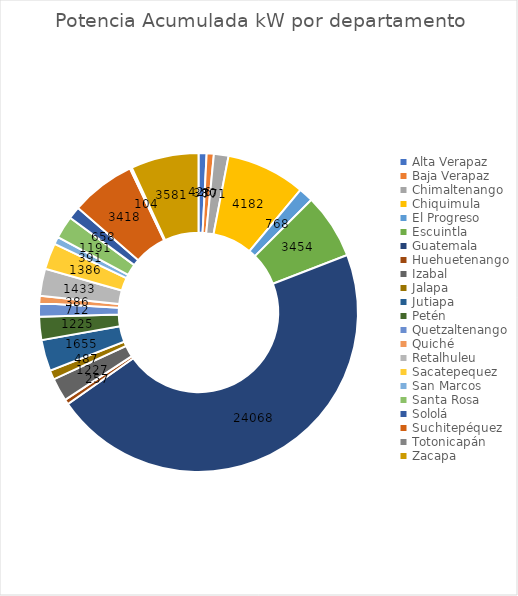
| Category | Potencia Acumulada kW |
|---|---|
| Alta Verapaz | 426 |
| Baja Verapaz | 380 |
| Chimaltenango | 771 |
| Chiquimula | 4182 |
| El Progreso | 768 |
| Escuintla | 3454 |
| Guatemala | 24068 |
| Huehuetenango | 257 |
| Izabal | 1227 |
| Jalapa | 487 |
| Jutiapa | 1655 |
| Petén | 1225 |
| Quetzaltenango | 712 |
| Quiché | 386 |
| Retalhuleu | 1433 |
| Sacatepequez | 1386 |
| San Marcos | 391 |
| Santa Rosa | 1191 |
| Sololá | 658 |
| Suchitepéquez | 3418 |
| Totonicapán | 104 |
| Zacapa | 3581 |